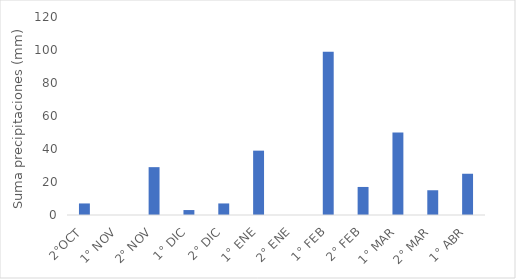
| Category | Precipitaciones  |
|---|---|
| 2°OCT | 7 |
| 1° NOV | 0 |
| 2° NOV | 29 |
| 1° DIC | 3 |
| 2° DIC | 7 |
| 1° ENE | 39 |
| 2° ENE | 0 |
| 1° FEB | 99 |
| 2° FEB | 17 |
| 1° MAR | 50 |
| 2° MAR | 15 |
| 1° ABR | 25 |